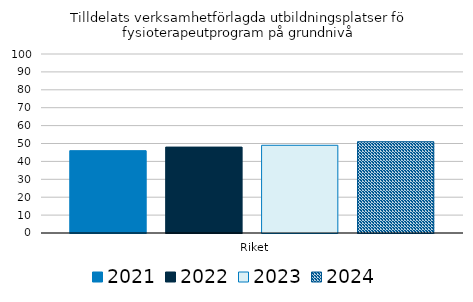
| Category | 2021 | 2022 | 2023 | 2024 |
|---|---|---|---|---|
|   Riket | 46 | 48 | 49 | 51 |